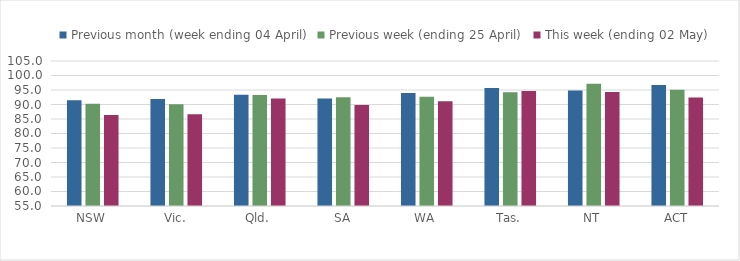
| Category | Previous month (week ending 04 April) | Previous week (ending 25 April) | This week (ending 02 May) |
|---|---|---|---|
| NSW | 91.438 | 90.257 | 86.35 |
| Vic. | 91.934 | 90.115 | 86.616 |
| Qld. | 93.367 | 93.286 | 92.051 |
| SA | 92.045 | 92.505 | 89.797 |
| WA | 93.957 | 92.7 | 91.083 |
| Tas. | 95.654 | 94.221 | 94.632 |
| NT | 94.865 | 97.143 | 94.35 |
| ACT | 96.704 | 95.094 | 92.442 |